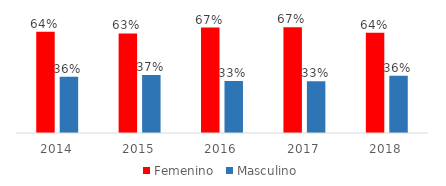
| Category | Femenino | Masculino |
|---|---|---|
| 2014.0 | 0.644 | 0.356 |
| 2015.0 | 0.632 | 0.368 |
| 2016.0 | 0.669 | 0.331 |
| 2017.0 | 0.671 | 0.329 |
| 2018.0 | 0.636 | 0.364 |